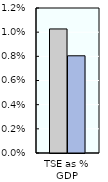
| Category | 2000-02 | 2018-20 |
|---|---|---|
| TSE as % GDP | 0.01 | 0.008 |